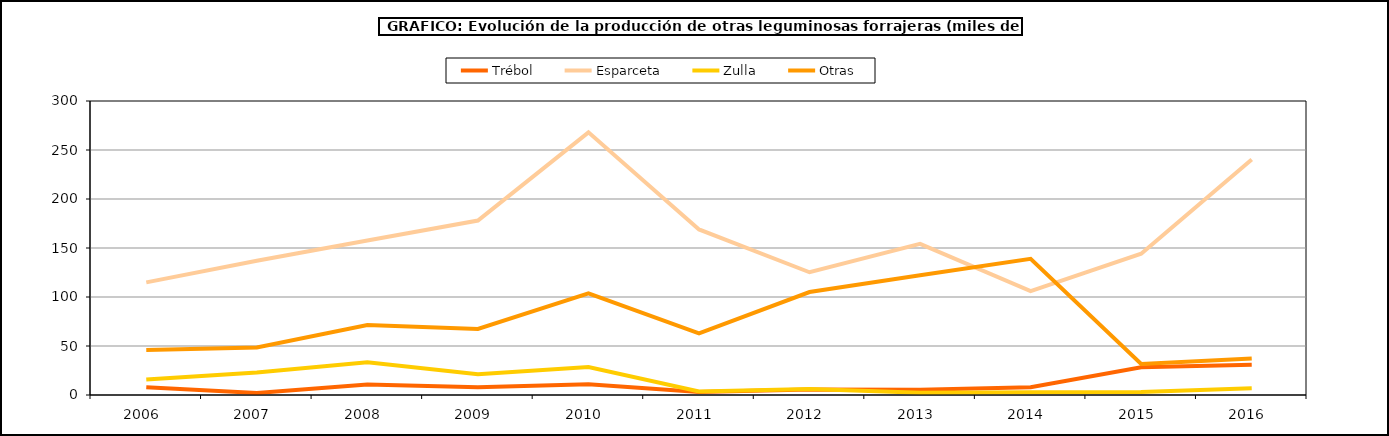
| Category | Trébol | Esparceta | Zulla | Otras |
|---|---|---|---|---|
| 2006.0 | 7.943 | 114.89 | 15.778 | 45.954 |
| 2007.0 | 2.089 | 137.076 | 22.848 | 48.521 |
| 2008.0 | 10.657 | 157.588 | 33.339 | 71.318 |
| 2009.0 | 7.859 | 178.059 | 21.305 | 67.327 |
| 2010.0 | 10.903 | 268.016 | 28.537 | 103.706 |
| 2011.0 | 2.955 | 168.906 | 3.64 | 62.873 |
| 2012.0 | 5.531 | 125.242 | 6.24 | 105.056 |
| 2013.0 | 5.243 | 154.216 | 2.307 | 122.265 |
| 2014.0 | 8 | 105.99 | 2.813 | 139.025 |
| 2015.0 | 28.241 | 144.128 | 3.1 | 31.635 |
| 2016.0 | 30.989 | 240.408 | 6.945 | 37.171 |